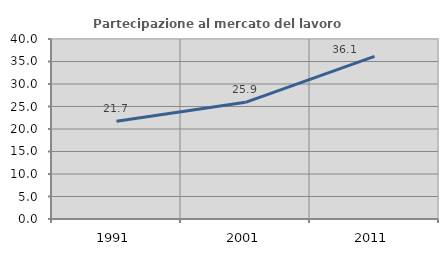
| Category | Partecipazione al mercato del lavoro  femminile |
|---|---|
| 1991.0 | 21.705 |
| 2001.0 | 25.926 |
| 2011.0 | 36.134 |